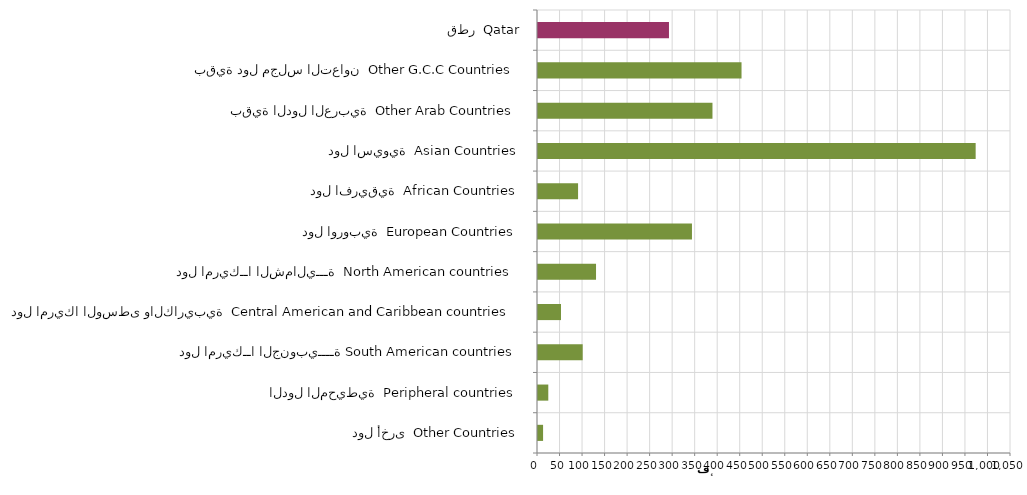
| Category | Series 0 |
|---|---|
| دول أخرى  Other Countries | 11271 |
| الدول المحيطية  Peripheral countries | 22859 |
| دول امريكــا الجنوبيــــة South American countries | 99212 |
| دول امريكا الوسطى والكاريبية  Central American and Caribbean countries | 51046 |
| دول امريكــا الشماليـــة  North American countries  | 128821 |
| دول اوروبية  European Countries | 341790 |
| دول افريقية  African Countries | 88959 |
| دول اسيوية  Asian Countries | 971546 |
| بقية الدول العربية  Other Arab Countries | 387307 |
| بقية دول مجلس التعاون  Other G.C.C Countries | 451805 |
| قطر  Qatar | 290745 |